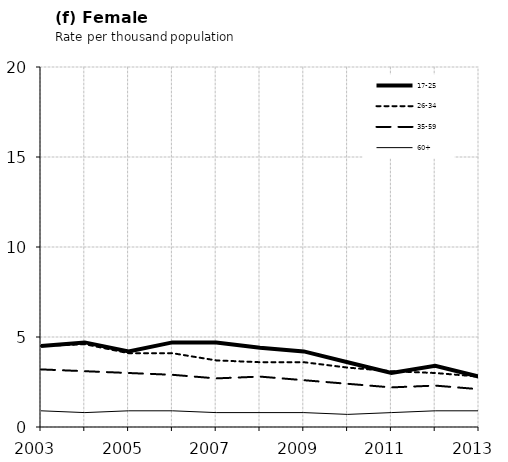
| Category | 17-25 | 26-34 | 35-59 | 60+ |
|---|---|---|---|---|
| 2003.0 | 4.5 | 4.5 | 3.2 | 0.9 |
| 2004.0 | 4.7 | 4.6 | 3.1 | 0.8 |
| 2005.0 | 4.2 | 4.1 | 3 | 0.9 |
| 2006.0 | 4.7 | 4.1 | 2.9 | 0.9 |
| 2007.0 | 4.7 | 3.7 | 2.7 | 0.8 |
| 2008.0 | 4.4 | 3.6 | 2.8 | 0.8 |
| 2009.0 | 4.2 | 3.6 | 2.6 | 0.8 |
| 2010.0 | 3.6 | 3.3 | 2.4 | 0.7 |
| 2011.0 | 3 | 3.1 | 2.2 | 0.8 |
| 2012.0 | 3.4 | 3 | 2.3 | 0.9 |
| 2013.0 | 2.8 | 2.8 | 2.1 | 0.9 |